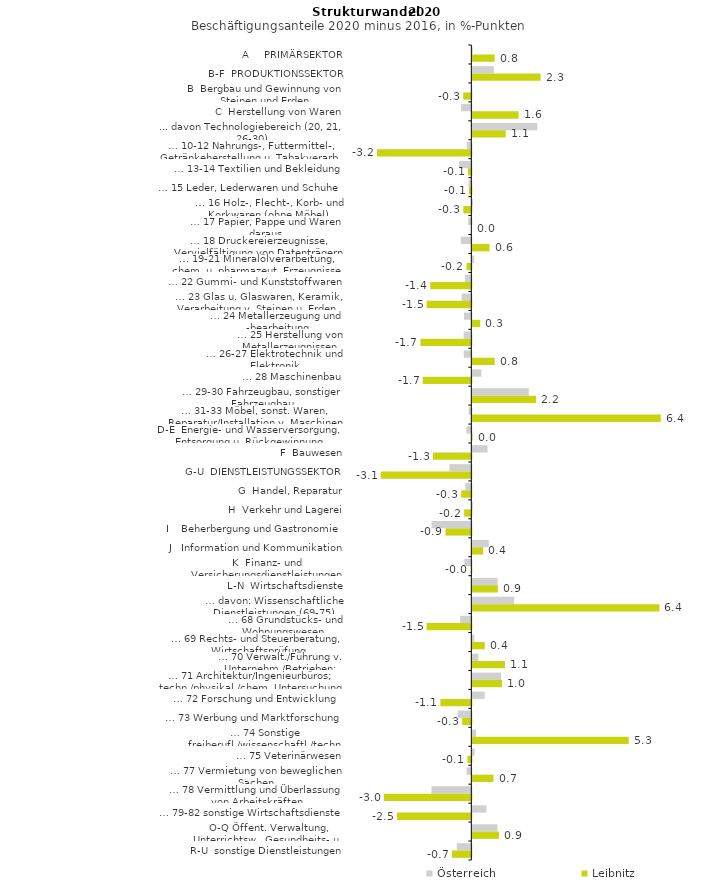
| Category | Österreich | Leibnitz |
|---|---|---|
| A     PRIMÄRSEKTOR | 0.018 | 0.762 |
| B-F  PRODUKTIONSSEKTOR | 0.731 | 2.326 |
| B  Bergbau und Gewinnung von Steinen und Erden | -0.006 | -0.275 |
| C  Herstellung von Waren | -0.347 | 1.575 |
| ... davon Technologiebereich (20, 21, 26-30) | 2.213 | 1.137 |
| … 10-12 Nahrungs-, Futtermittel-, Getränkeherstellung u. Tabakverarb. | -0.156 | -3.217 |
| … 13-14 Textilien und Bekleidung | -0.417 | -0.118 |
| … 15 Leder, Lederwaren und Schuhe | -0.095 | -0.081 |
| … 16 Holz-, Flecht-, Korb- und Korkwaren (ohne Möbel)  | 0.023 | -0.272 |
| … 17 Papier, Pappe und Waren daraus  | -0.11 | 0 |
| … 18 Druckereierzeugnisse, Vervielfältigung von Datenträgern | -0.357 | 0.586 |
| … 19-21 Mineralölverarbeitung, chem. u. pharmazeut. Erzeugnisse | 0.063 | -0.165 |
| … 22 Gummi- und Kunststoffwaren | -0.217 | -1.399 |
| … 23 Glas u. Glaswaren, Keramik, Verarbeitung v. Steinen u. Erden  | -0.33 | -1.524 |
| … 24 Metallerzeugung und -bearbeitung | -0.251 | 0.269 |
| … 25 Herstellung von Metallerzeugnissen  | -0.261 | -1.737 |
| … 26-27 Elektrotechnik und Elektronik | -0.258 | 0.763 |
| … 28 Maschinenbau | 0.309 | -1.657 |
| … 29-30 Fahrzeugbau, sonstiger Fahrzeugbau | 1.924 | 2.174 |
| … 31-33 Möbel, sonst. Waren, Reparatur/Installation v. Maschinen | -0.089 | 6.425 |
| D-E  Energie- und Wasserversorgung, Entsorgung u. Rückgewinnung | -0.17 | 0.011 |
| F  Bauwesen | 0.522 | -1.311 |
| G-U  DIENSTLEISTUNGSSEKTOR | -0.749 | -3.088 |
| G  Handel, Reparatur | -0.208 | -0.346 |
| H  Verkehr und Lagerei | 0.02 | -0.245 |
| I    Beherbergung und Gastronomie | -1.357 | -0.881 |
| J   Information und Kommunikation | 0.559 | 0.369 |
| K  Finanz- und Versicherungsdienstleistungen | -0.241 | -0.006 |
| L-N  Wirtschaftsdienste | 0.862 | 0.871 |
| … davon: Wissenschaftliche Dienstleistungen (69-75) | 1.424 | 6.379 |
| … 68 Grundstücks- und Wohnungswesen  | -0.382 | -1.527 |
| … 69 Rechts- und Steuerberatung, Wirtschaftsprüfung | 0.071 | 0.425 |
| … 70 Verwalt./Führung v. Unternehm./Betrieben; Unternehmensberat. | 0.205 | 1.111 |
| … 71 Architektur/Ingenieurbüros; techn./physikal./chem. Untersuchung | 0.976 | 1.013 |
| … 72 Forschung und Entwicklung  | 0.423 | -1.055 |
| … 73 Werbung und Marktforschung | -0.459 | -0.313 |
| … 74 Sonstige freiberufl./wissenschaftl./techn. Tätigkeiten | 0.13 | 5.332 |
| … 75 Veterinärwesen | 0.078 | -0.133 |
| … 77 Vermietung von beweglichen Sachen  | -0.163 | 0.722 |
| … 78 Vermittlung und Überlassung von Arbeitskräften | -1.357 | -2.982 |
| … 79-82 sonstige Wirtschaftsdienste | 0.479 | -2.532 |
| O-Q Öffent. Verwaltung, Unterrichtsw., Gesundheits- u. Sozialwesen | 0.859 | 0.909 |
| R-U  sonstige Dienstleistungen | -0.495 | -0.664 |